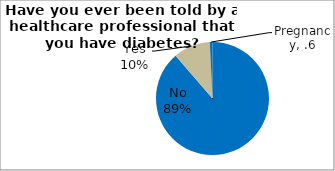
| Category | Series 0 |
|---|---|
| No | 88.663 |
| Yes | 10.567 |
| Pregnancy | 0.77 |